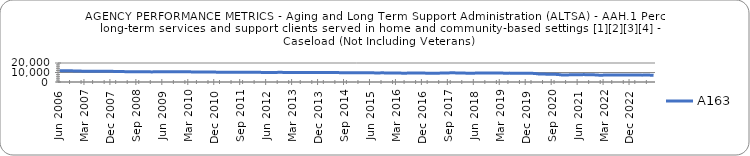
| Category | A163 |
|---|---|
| 0.76721 | 11784.033 |
| 0.76724 | 11782.581 |
| 0.76937 | 11819.71 |
| 0.77188 | 11786.767 |
| 0.77291 | 11743.548 |
| 0.77287 | 11684.8 |
| 0.77281 | 11576.355 |
| 0.77321 | 11512.581 |
| 0.77487 | 11407.464 |
| 0.77588 | 11316.161 |
| 0.77547 | 11267.633 |
| 0.77665 | 11303.452 |
| 0.77799 | 11303.9 |
| 0.78001 | 11297.71 |
| 0.78165 | 11256.355 |
| 0.78378 | 11238.1 |
| 0.78567 | 11351 |
| 0.78719 | 11295 |
| 0.7887 | 11233 |
| 0.79022 | 11157 |
| 0.79129 | 11082 |
| 0.79193 | 11021 |
| 0.79455 | 10947 |
| 0.79439 | 10897 |
| 0.79457 | 10804 |
| 0.79632 | 10773 |
| 0.79721 | 10774 |
| 0.79865 | 10788 |
| 0.79917 | 10728 |
| 0.79965 | 10758 |
| 0.79991 | 10780 |
| 0.80036 | 10664 |
| 0.80119 | 10651 |
| 0.80135 | 10664 |
| 0.80196 | 10683 |
| 0.80282 | 10711 |
| 0.80375 | 10734 |
| 0.80441 | 10767 |
| 0.80454 | 10776 |
| 0.80574 | 10817 |
| 0.80717 | 10843 |
| 0.80907 | 10804 |
| 0.80996 | 10766 |
| 0.81048 | 10698 |
| 0.81132 | 10687 |
| 0.81235 | 10695 |
| 0.81422 | 10628 |
| 0.81521 | 10574 |
| 0.81511 | 10567 |
| 0.816 | 10590 |
| 0.81562 | 10576 |
| 0.8177 | 10547 |
| 0.81902 | 10478 |
| 0.81999 | 10404 |
| 0.8202 | 10411 |
| 0.82092 | 10357 |
| 0.82336 | 10343 |
| 0.82379 | 10330 |
| 0.82545 | 10285 |
| 0.82578 | 10276 |
| 0.82632 | 10277 |
| 0.82543 | 10258.482 |
| 0.82484 | 10208.108 |
| 0.82636 | 10203.666 |
| 0.82733 | 10200.17 |
| 0.82838 | 10172.006 |
| 0.82888 | 10195.869 |
| 0.82809 | 10160.287 |
| 0.82917 | 10196.578 |
| 0.82866 | 10167.044 |
| 0.82858 | 10126.453 |
| 0.82802 | 10089.547 |
| 0.82938 | 10074.189 |
| 0.83046 | 10119.459 |
| 0.83086 | 10096.399 |
| 0.83171 | 10090.728 |
| 0.83162 | 10155.372 |
| 0.83156 | 10163.028 |
| 0.8309 | 10072.771 |
| 0.83222 | 10012.994 |
| 0.83276 | 9951.564 |
| 0.83338 | 9922.03 |
| 0.83336 | 9951.422 |
| 0.83239 | 9995.983 |
| 0.83251 | 10037.331 |
| 0.8337 | 9976.372 |
| 0.83426 | 9971.174 |
| 0.83557 | 9934.788 |
| 0.83627 | 9983.46 |
| 0.83614 | 10054.5 |
| 0.83597 | 10055.76 |
| 0.83796 | 9996.692 |
| 0.83821 | 9934 |
| 0.83855 | 9904.789 |
| 0.84014 | 9869 |
| 0.83995 | 9914 |
| 0.84007 | 9940 |
| 0.8402 | 9861 |
| 0.841 | 9844 |
| 0.8424 | 9860 |
| 0.8431 | 9813 |
| 0.8435 | 9809 |
| 0.8439 | 9838 |
| 0.84383 | 9737 |
| 0.84463 | 9685 |
| 0.84443 | 9694 |
| 0.84487 | 9705 |
| 0.84543 | 9709 |
| 0.8466 | 9696 |
| 0.84682 | 9606 |
| 0.84816 | 9583 |
| 0.84589 | 9594 |
| 0.84646 | 9623 |
| 0.84772 | 9585 |
| 0.8486 | 9515 |
| 0.84786 | 9459 |
| 0.84849 | 9415 |
| 0.84851 | 9367 |
| 0.8492 | 9366 |
| 0.84852 | 9319 |
| 0.84989 | 9312 |
| 0.85076 | 9364 |
| 0.85196 | 9391 |
| 0.8534 | 9441 |
| 0.85355 | 9429 |
| 0.85326 | 9499 |
| 0.85294 | 9403 |
| 0.85119 | 9330 |
| 0.85152 | 9238 |
| 0.85143 | 9231 |
| 0.85182 | 9235 |
| 0.8521 | 9290 |
| 0.85264 | 9347 |
| 0.85441 | 9551.065 |
| 0.85526 | 9585.226 |
| 0.85728 | 9597.433 |
| 0.8577 | 9614.355 |
| 0.85845 | 9613.067 |
| 0.85828 | 9573.484 |
| 0.85799 | 9458.484 |
| 0.85772 | 9396.75 |
| 0.85887 | 9324.258 |
| 0.86116 | 9311.267 |
| 0.86123 | 9305.645 |
| 0.86193 | 9332.233 |
| 0.86372 | 9416.484 |
| 0.86147 | 9478.613 |
| 0.86303 | 9489.567 |
| 0.86431 | 9424.839 |
| 0.86533 | 9403.533 |
| 0.86473 | 9414.484 |
| 0.86411 | 9379.355 |
| 0.86504 | 9417 |
| 0.86518 | 9382.645 |
| 0.86641 | 9333.067 |
| 0.86717 | 9309.677 |
| 0.86792 | 9342.067 |
| 0.8694 | 9282.903 |
| 0.86921 | 9267.226 |
| 0.87375 | 9292.267 |
| 0.87927 | 9259.516 |
| 0.88196 | 9215.3 |
| 0.8826 | 9170.452 |
| 0.88378 | 9155.258 |
| 0.88511 | 9124.276 |
| 0.8857 | 8928.194 |
| 0.88923 | 8535.233 |
| 0.89424 | 8342.871 |
| 0.89466 | 8338.867 |
| 0.89512 | 8241.387 |
| 0.89475 | 8147.065 |
| 0.89525 | 8121.333 |
| 0.89485 | 8066.419 |
| 0.89346 | 7876.533 |
| 0.89386 | 7472.871 |
| 0.89048 | 7403.677 |
| 0.89013 | 7463.357 |
| 0.89185 | 7516.387 |
| 0.8934 | 7558.4 |
| 0.89298 | 7674.645 |
| 0.89372 | 7694.333 |
| 0.89661 | 7742.71 |
| 0.89824 | 7773.097 |
| 0.89708 | 7629.167 |
| 0.89662 | 7517.097 |
| 0.89759 | 7525.1 |
| 0.89814 | 7476.71 |
| 0.89823 | 7223.484 |
| 0.89819 | 7142.036 |
| 0.89789 | 7327.161 |
| 0.89829 | 7416.133 |
| 0.89874 | 7375.226 |
| 0.90061 | 7363.3 |
| 0.90125 | 7385.129 |
| 0.90115 | 7439.516 |
| 0.90196 | 7474.867 |
| 0.90133 | 7478.452 |
| 0.90135 | 7456.4 |
| 0.90118 | 7352.161 |
| 0.90219 | 7333.29 |
| 0.90296 | 7351.429 |
| 0.90356 | 7409.161 |
| 0.90607 | 7215.1 |
| 0.90755 | 7311.548 |
| 0.91023 | 7319.8 |
| nan | 7213.968 |
| nan | 6971.387 |